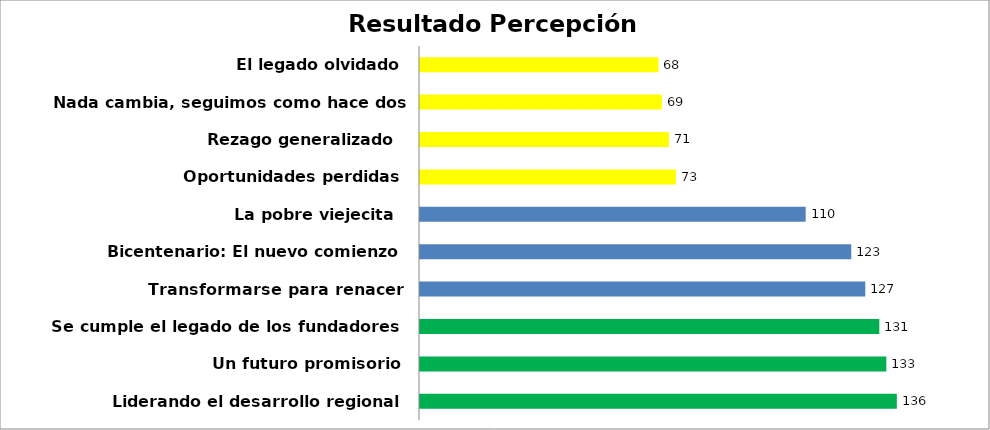
| Category | Series 0 |
|---|---|
| Liderando el desarrollo regional | 136 |
| Un futuro promisorio | 133 |
| Se cumple el legado de los fundadores | 131 |
| Transformarse para renacer | 127 |
| Bicentenario: El nuevo comienzo | 123 |
| La pobre viejecita  | 110 |
| Oportunidades perdidas | 73 |
| Rezago generalizado  | 71 |
| Nada cambia, seguimos como hace dos décadas | 69 |
|  El legado olvidado | 68 |